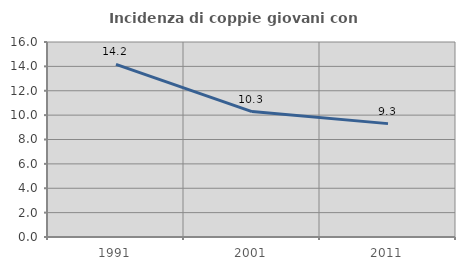
| Category | Incidenza di coppie giovani con figli |
|---|---|
| 1991.0 | 14.159 |
| 2001.0 | 10.288 |
| 2011.0 | 9.302 |